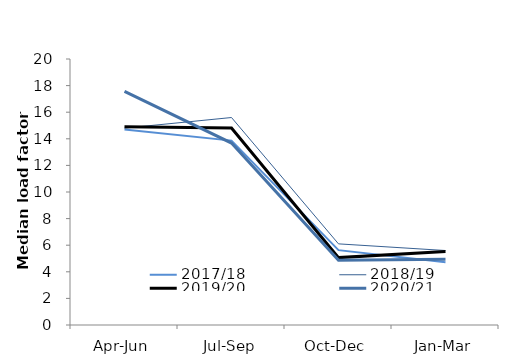
| Category | 2017/18 | 2018/19 | 2019/20 | 2020/21 |
|---|---|---|---|---|
| Apr-Jun | 14.7 | 14.8 | 14.911 | 17.57 |
| Jul-Sep | 13.863 | 15.6 | 14.816 | 13.681 |
| Oct-Dec | 5.629 | 6.1 | 5.067 | 4.87 |
| Jan-Mar | 4.725 | 5.6 | 5.533 | 4.937 |